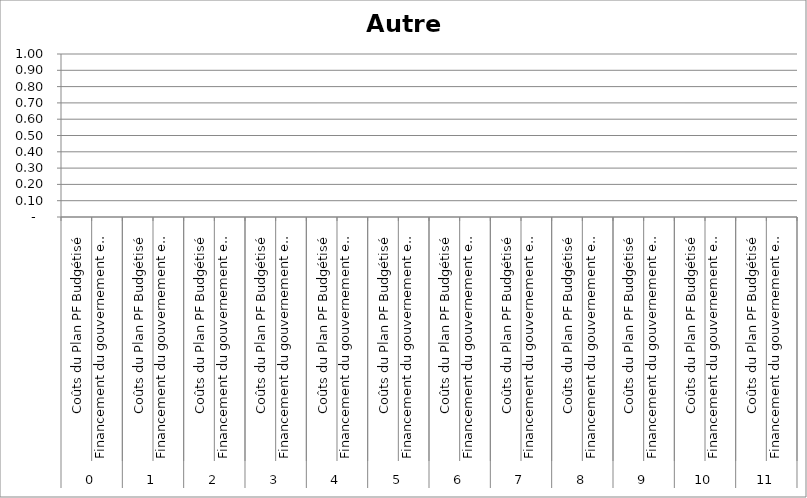
| Category | Autre 9 |
|---|---|
| 0 | 0 |
| 1 | 0 |
| 2 | 0 |
| 3 | 0 |
| 4 | 0 |
| 5 | 0 |
| 6 | 0 |
| 7 | 0 |
| 8 | 0 |
| 9 | 0 |
| 10 | 0 |
| 11 | 0 |
| 12 | 0 |
| 13 | 0 |
| 14 | 0 |
| 15 | 0 |
| 16 | 0 |
| 17 | 0 |
| 18 | 0 |
| 19 | 0 |
| 20 | 0 |
| 21 | 0 |
| 22 | 0 |
| 23 | 0 |